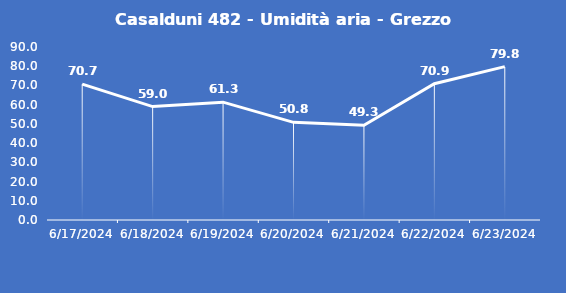
| Category | Casalduni 482 - Umidità aria - Grezzo (%) |
|---|---|
| 6/17/24 | 70.7 |
| 6/18/24 | 59 |
| 6/19/24 | 61.3 |
| 6/20/24 | 50.8 |
| 6/21/24 | 49.3 |
| 6/22/24 | 70.9 |
| 6/23/24 | 79.8 |